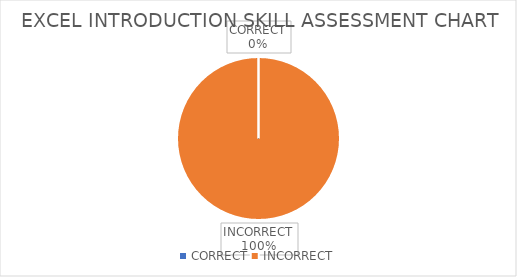
| Category | Series 0 |
|---|---|
| CORRECT | 0 |
| INCORRECT | 26 |